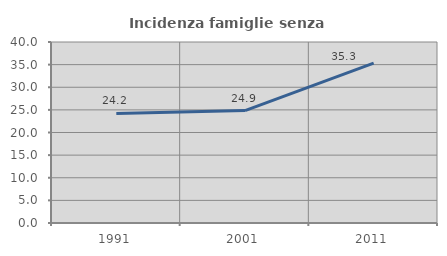
| Category | Incidenza famiglie senza nuclei |
|---|---|
| 1991.0 | 24.225 |
| 2001.0 | 24.854 |
| 2011.0 | 35.332 |